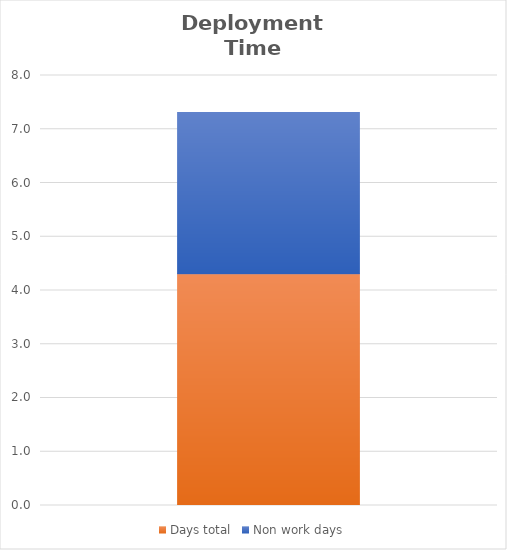
| Category | Days total | Non work days |
|---|---|---|
| 0 | 4.313 | 3 |